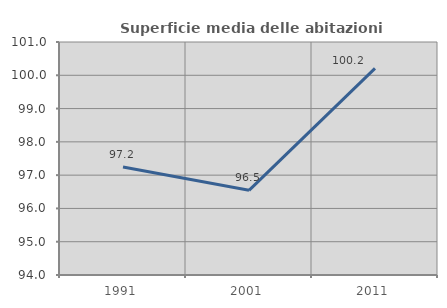
| Category | Superficie media delle abitazioni occupate |
|---|---|
| 1991.0 | 97.245 |
| 2001.0 | 96.544 |
| 2011.0 | 100.207 |